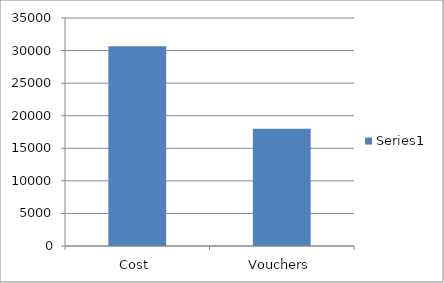
| Category | Series 0 |
|---|---|
| Cost  | 30664 |
| Vouchers | 18000 |